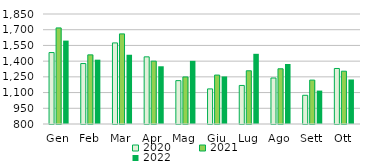
| Category | 2020 | 2021 | 2022 |
|---|---|---|---|
| Gen | 1482 | 1717 | 1596 |
| Feb | 1377 | 1460 | 1414 |
| Mar | 1574 | 1660 | 1461 |
| Apr | 1441 | 1400 | 1351 |
| Mag | 1214 | 1249 | 1403 |
| Giu | 1135 | 1267 | 1254 |
| Lug | 1168 | 1308 | 1470 |
| Ago | 1239 | 1327 | 1373 |
| Sett | 1074 | 1219 | 1119 |
| Ott | 1330 | 1304 | 1225 |